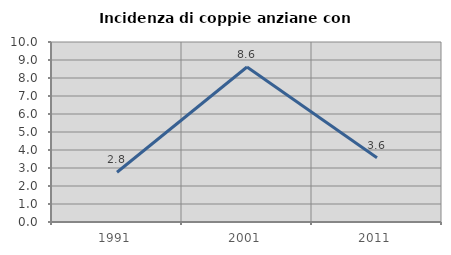
| Category | Incidenza di coppie anziane con figli |
|---|---|
| 1991.0 | 2.762 |
| 2001.0 | 8.609 |
| 2011.0 | 3.571 |